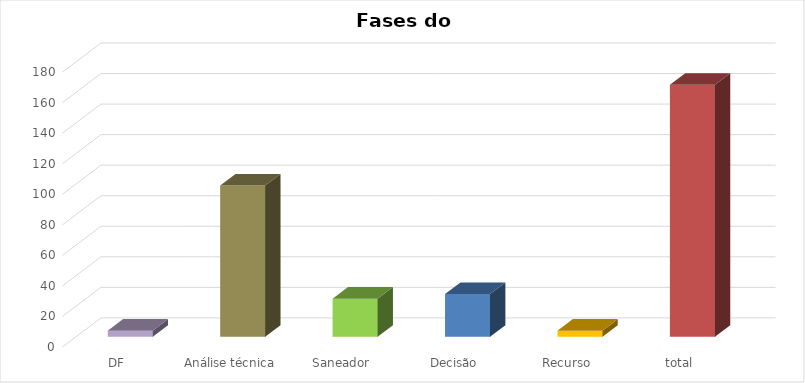
| Category | Quatidade |
|---|---|
| DF | 4 |
| Análise técnica | 99 |
| Saneador | 25 |
| Decisão | 28 |
| Recurso | 4 |
| total | 165 |